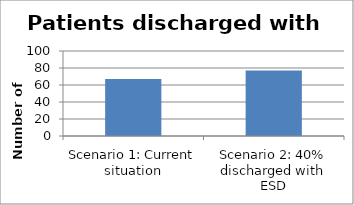
| Category | Number of patients |
|---|---|
| Scenario 1: Current situation | 67 |
| Scenario 2: 40% discharged with ESD | 77 |